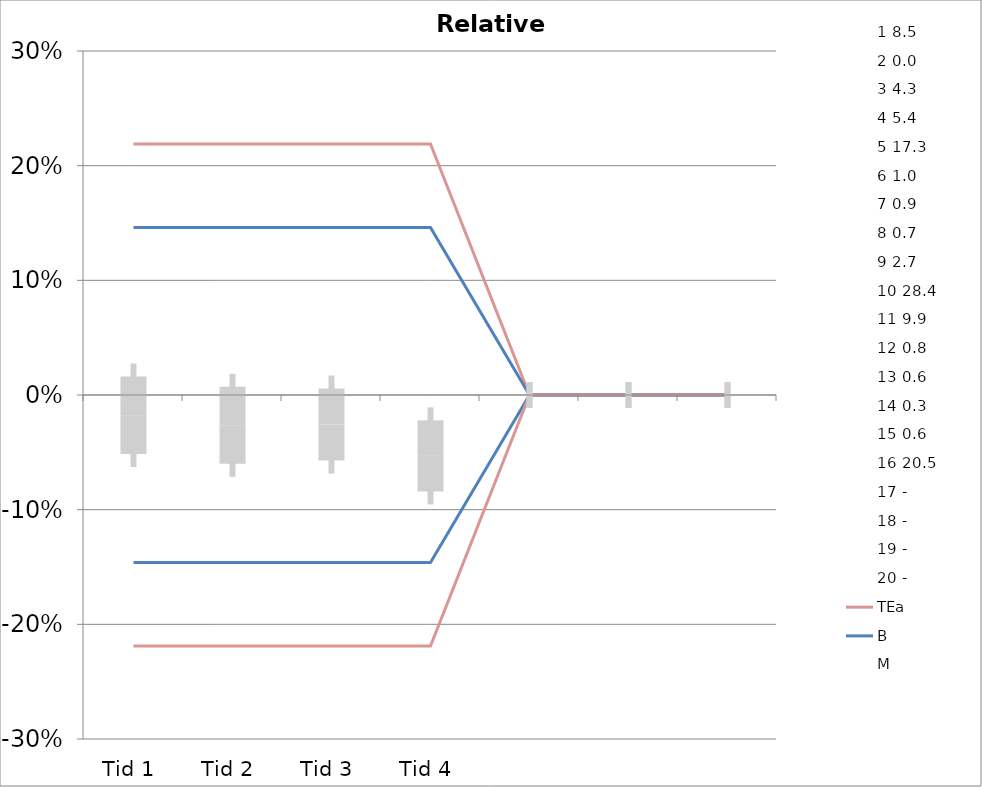
| Category | 1 | 2 | 3 | 4 | 5 | 6 | 7 | 8 | 9 | 10 | 11 | 12 | 13 | 14 | 15 | 16 | 17 | 18 | 19 | 20 | TEa | B | -B | -TEa | M |
|---|---|---|---|---|---|---|---|---|---|---|---|---|---|---|---|---|---|---|---|---|---|---|---|---|---|
| Tid 1 | -0.007 | 0 | -0.082 | -0.015 | -0.173 | -0.058 | 0 | -0.068 | -0.007 | 0.036 | -0.043 | -0.06 | 0.018 | 0.067 | 0.018 | 0.093 | 0 | 0 | 0 | 0 | 0.219 | 0.146 | -0.146 | -0.219 | -0.018 |
| Tid 2 | -0.061 | 0 | -0.049 | 0.028 | -0.149 | -0.058 | 0.034 | -0.122 | 0.052 | 0.063 | -0.032 | -0.108 | -0.035 | 0 | 0.036 | -0.02 | 0 | 0 | 0 | 0 | 0.219 | 0.146 | -0.146 | -0.219 | -0.026 |
| Tid 3 | -0.025 | 0 | -0.033 | 0.045 | 0 | -0.068 | -0.045 | -0.122 | -0.03 | 0.026 | -0.048 | -0.108 | 0 | 0.067 | -0.089 | 0.044 | 0 | 0 | 0 | 0 | 0.219 | 0.146 | -0.146 | -0.219 | -0.026 |
| Tid 4 | -0.059 | 0 | -0.019 | -0.022 | 0 | -0.097 | 0 | -0.162 | -0.026 | 0 | -0.124 | -0.12 | -0.035 | 0 | -0.071 | -0.007 | 0 | 0 | 0 | 0 | 0.219 | 0.146 | -0.146 | -0.219 | -0.053 |